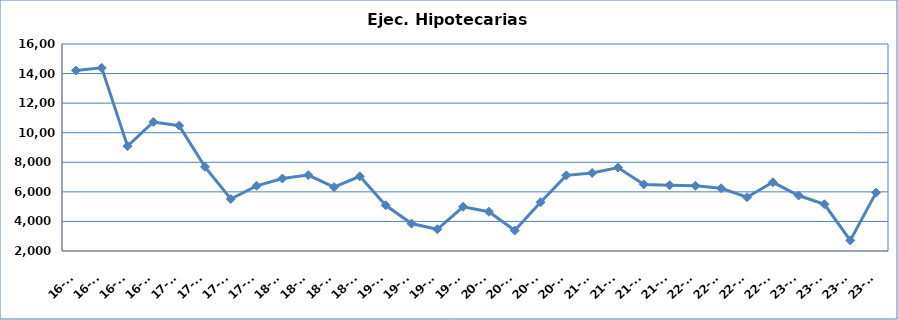
| Category | Ej. Hipotecarias |
|---|---|
| 16-T1 | 14205 |
| 16-T2 | 14385 |
| 16-T3 | 9094 |
| 16-T4 | 10726 |
| 17-T1 | 10478 |
| 17-T2 | 7689 |
| 17-T3 | 5518 |
| 17-T4 | 6409 |
| 18-T1 | 6903 |
| 18-T2 | 7137 |
| 18-T3 | 6315 |
| 18-T4 | 7049 |
| 19-T1 | 5092 |
| 19-T2 | 3857 |
| 19-T3 | 3470 |
| 19-T4 | 4992 |
| 20-T1 | 4658 |
| 20-T2 | 3387 |
| 20-T3 | 5299 |
| 20-T4 | 7116 |
| 21-T1 | 7280 |
| 21-T2 | 7641 |
| 21-T3 | 6504 |
| 21-T4 | 6449 |
| 22-T1 | 6410 |
| 22-T2 | 6242 |
| 22-T3 | 5637 |
| 22-T4 | 6646 |
| 23-T1 | 5753 |
| 23-T2 | 5161 |
| 23-T3 | 2716 |
| 23-T4 | 5947 |